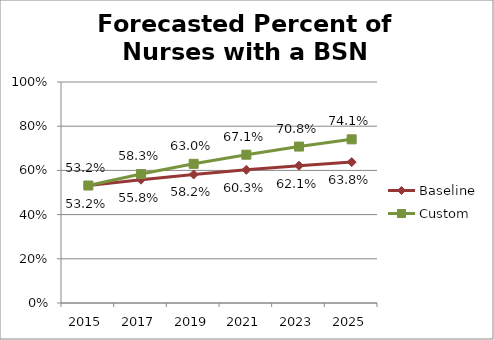
| Category | Baseline | Custom |
|---|---|---|
| 2015.0 | 0.532 | 0.532 |
| 2017.0 | 0.558 | 0.583 |
| 2019.0 | 0.582 | 0.63 |
| 2021.0 | 0.603 | 0.671 |
| 2023.0 | 0.621 | 0.708 |
| 2025.0 | 0.638 | 0.741 |